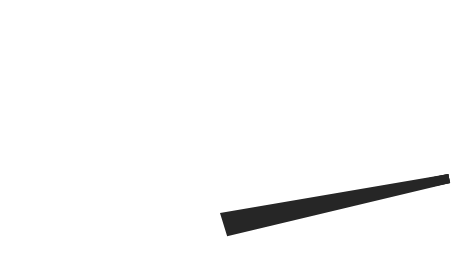
| Category | y |
|---|---|
| 98.50770327597388 | 12.124 |
| 50.48497871770225 | -1.94 |
| 49.51502128229775 | 1.94 |
| 98.50770327597388 | 12.124 |
| 50.0 | 0 |